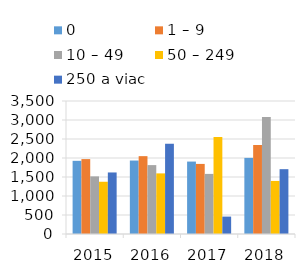
| Category | 0 | 1 – 9  | 10 – 49  | 50 – 249  | 250 a viac |
|---|---|---|---|---|---|
| 2015.0 | 1925.501 | 1971.02 | 1516.195 | 1375 | 1619.433 |
| 2016.0 | 1933.117 | 2048.863 | 1813.171 | 1594.953 | 2374.332 |
| 2017.0 | 1906 | 1844.284 | 1581.453 | 2552.81 | 457.897 |
| 2018.0 | 2002.991 | 2343.15 | 3081.495 | 1396.419 | 1705.882 |